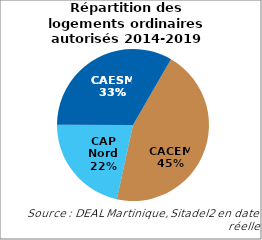
| Category | Series 2 |
|---|---|
| CACEM | 7385 |
| CAP Nord | 3540 |
| CAESM | 5455 |